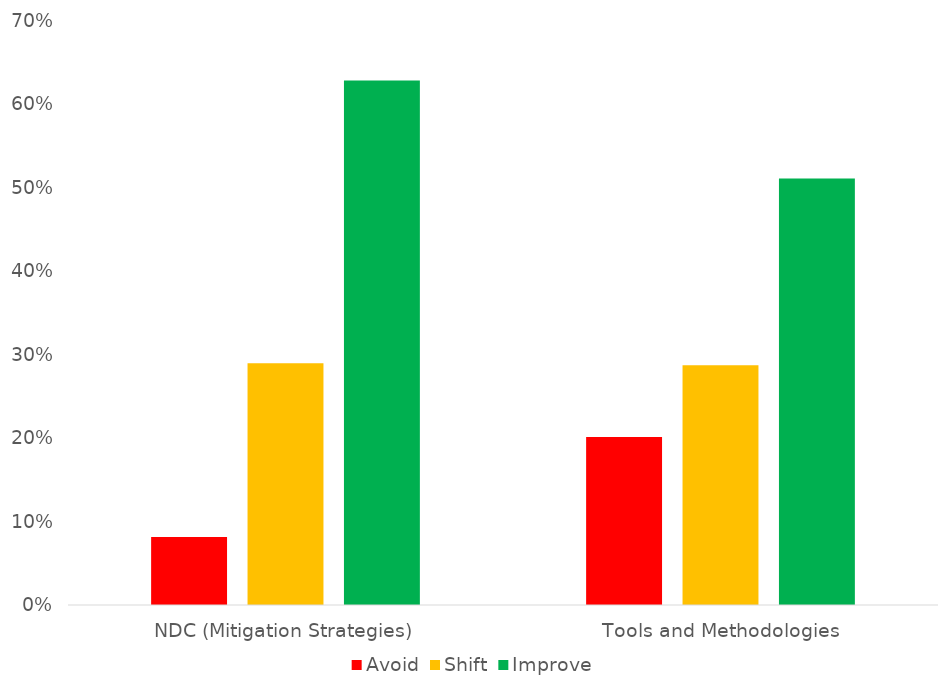
| Category | Series 0 |
|---|---|
| CO2 | 150 |
| PM | 62 |
| NOx | 62 |
| SLCP | 10 |
| Travel time | 8 |
| Fuel savings | 41 |
| Road safety | 13 |
| Other | 35 |